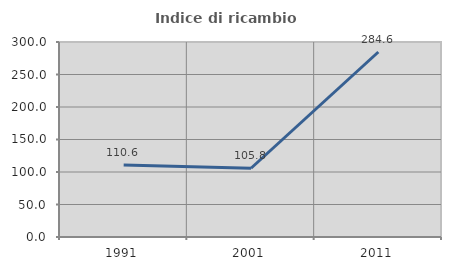
| Category | Indice di ricambio occupazionale  |
|---|---|
| 1991.0 | 110.638 |
| 2001.0 | 105.769 |
| 2011.0 | 284.615 |